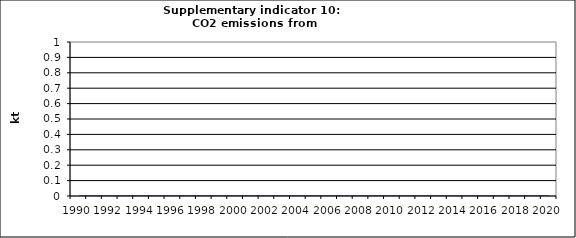
| Category | CO2 emissions from autoproducers, kt |
|---|---|
| 1990 | 0 |
| 1991 | 0 |
| 1992 | 0 |
| 1993 | 0 |
| 1994 | 0 |
| 1995 | 0 |
| 1996 | 0 |
| 1997 | 0 |
| 1998 | 0 |
| 1999 | 0 |
| 2000 | 0 |
| 2001 | 0 |
| 2002 | 0 |
| 2003 | 0 |
| 2004 | 0 |
| 2005 | 0 |
| 2006 | 0 |
| 2007 | 0 |
| 2008 | 0 |
| 2009 | 0 |
| 2010 | 0 |
| 2011 | 0 |
| 2012 | 0 |
| 2013 | 0 |
| 2014 | 0 |
| 2015 | 0 |
| 2016 | 0 |
| 2017 | 0 |
| 2018 | 0 |
| 2019 | 0 |
| 2020 | 0 |